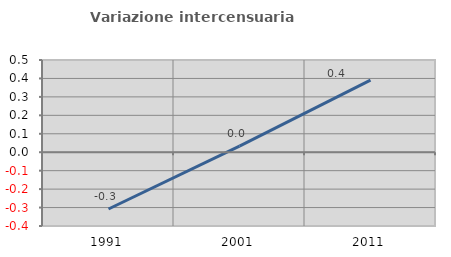
| Category | Variazione intercensuaria annua |
|---|---|
| 1991.0 | -0.308 |
| 2001.0 | 0.033 |
| 2011.0 | 0.391 |